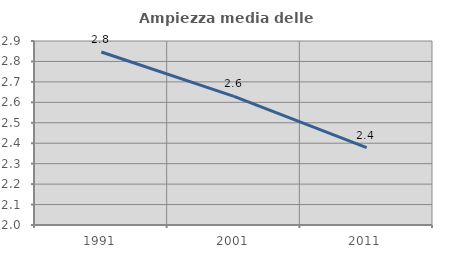
| Category | Ampiezza media delle famiglie |
|---|---|
| 1991.0 | 2.846 |
| 2001.0 | 2.629 |
| 2011.0 | 2.379 |